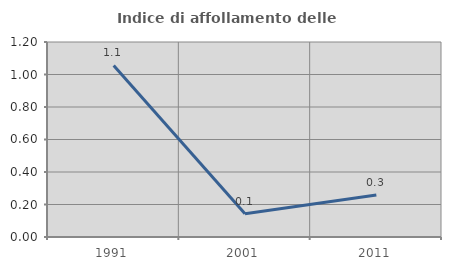
| Category | Indice di affollamento delle abitazioni  |
|---|---|
| 1991.0 | 1.056 |
| 2001.0 | 0.143 |
| 2011.0 | 0.258 |